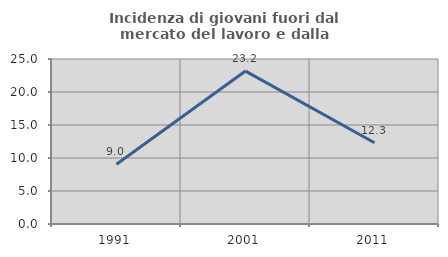
| Category | Incidenza di giovani fuori dal mercato del lavoro e dalla formazione  |
|---|---|
| 1991.0 | 9.043 |
| 2001.0 | 23.171 |
| 2011.0 | 12.319 |